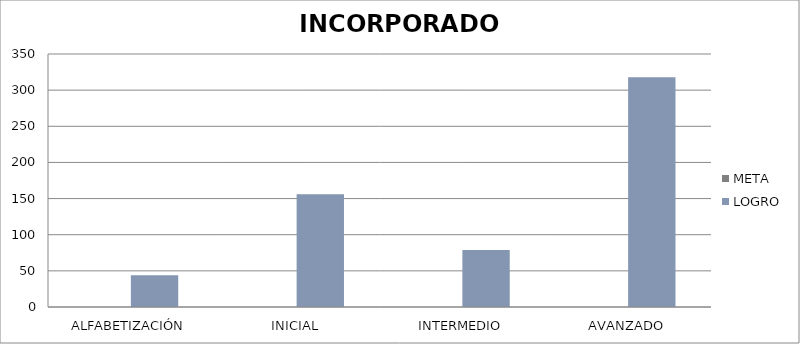
| Category | META | LOGRO |
|---|---|---|
| ALFABETIZACIÓN | 0 | 44 |
| INICIAL | 0 | 156 |
| INTERMEDIO | 0 | 79 |
| AVANZADO | 0 | 318 |